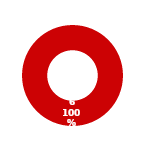
| Category | IAM |
|---|---|
| MIL 1 Complete | 0 |
| MIL 1 Not Complete | 6 |